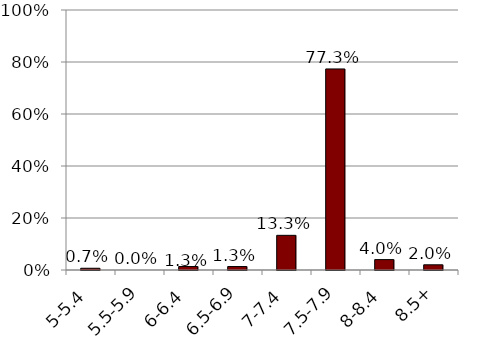
| Category | Series 1 |
|---|---|
| 5-5.4 | 0.007 |
| 5.5-5.9 | 0 |
| 6-6.4 | 0.013 |
| 6.5-6.9 | 0.013 |
| 7-7.4 | 0.133 |
| 7.5-7.9 | 0.773 |
| 8-8.4 | 0.04 |
| 8.5+ | 0.02 |